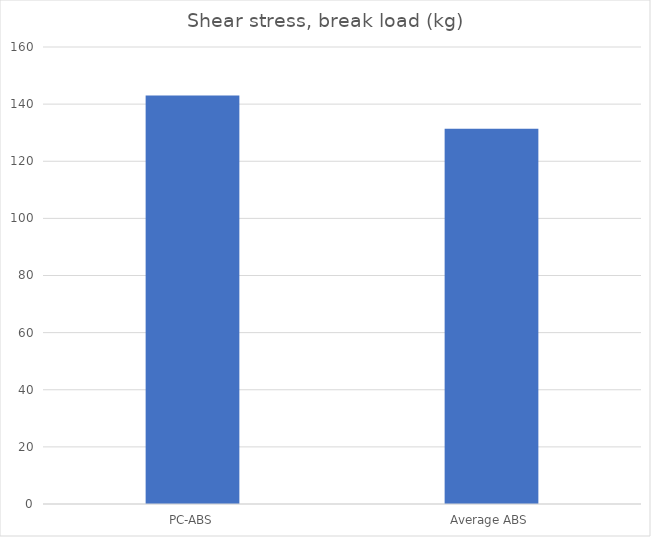
| Category | Break kg |
|---|---|
| PC-ABS | 143 |
| Average ABS | 131.4 |